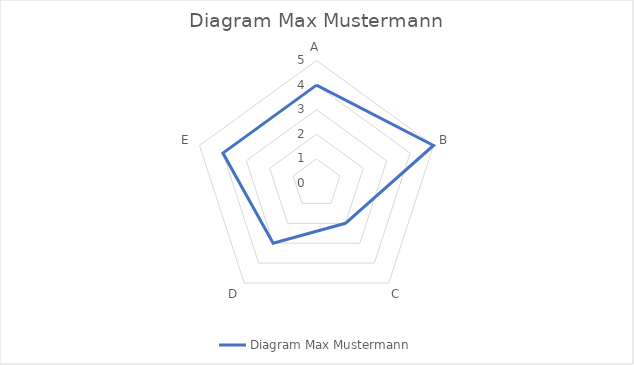
| Category | Diagram Max Mustermann |
|---|---|
| A | 4 |
| B | 5 |
| C | 2 |
| D | 3 |
| E | 4 |